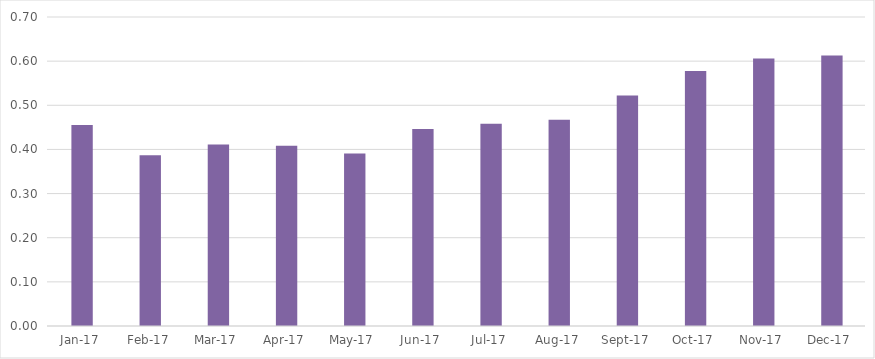
| Category | Коэффициент задолженности |
|---|---|
| 2017-01-01 | 0.455 |
| 2017-02-01 | 0.387 |
| 2017-03-01 | 0.411 |
| 2017-04-01 | 0.408 |
| 2017-05-01 | 0.391 |
| 2017-06-01 | 0.446 |
| 2017-07-01 | 0.458 |
| 2017-08-01 | 0.467 |
| 2017-09-01 | 0.522 |
| 2017-10-01 | 0.578 |
| 2017-11-01 | 0.606 |
| 2017-12-01 | 0.613 |